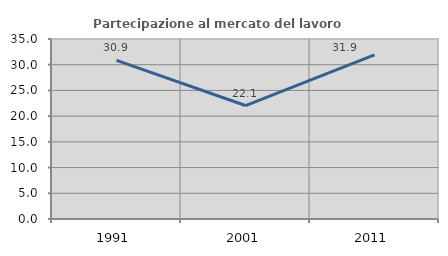
| Category | Partecipazione al mercato del lavoro  femminile |
|---|---|
| 1991.0 | 30.855 |
| 2001.0 | 22.064 |
| 2011.0 | 31.923 |